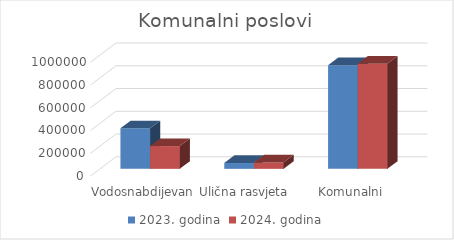
| Category | 2023. godina | 2024. godina |
|---|---|---|
| Vodosnabdijevanje | 356030 | 200000 |
| Ulična rasvjeta | 51000 | 56000 |
| Komunalni poslovi | 910900 | 923300 |